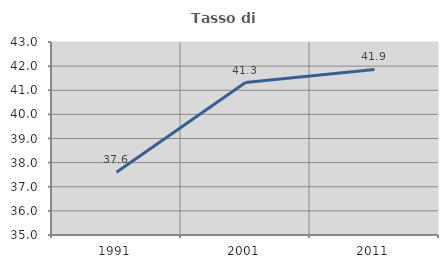
| Category | Tasso di occupazione   |
|---|---|
| 1991.0 | 37.605 |
| 2001.0 | 41.321 |
| 2011.0 | 41.86 |